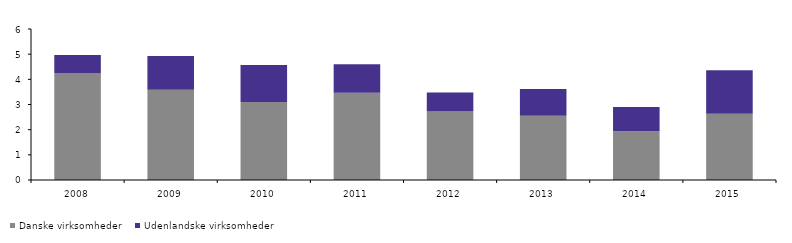
| Category | Danske virksomheder | Udenlandske virksomheder |
|---|---|---|
| 2008.0 | 4.247 | 0.721 |
| 2009.0 | 3.584 | 1.339 |
| 2010.0 | 3.095 | 1.477 |
| 2011.0 | 3.467 | 1.137 |
| 2012.0 | 2.723 | 0.755 |
| 2013.0 | 2.558 | 1.059 |
| 2014.0 | 1.941 | 0.963 |
| 2015.0 | 2.628 | 1.734 |